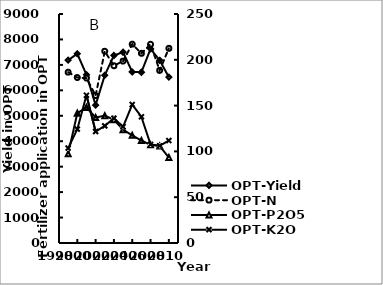
| Category | OPT-Yield |
|---|---|
| 1999.0 | 7187.37 |
| 2000.0 | 7436.929 |
| 2001.0 | 6612.92 |
| 2002.0 | 5419.915 |
| 2003.0 | 6594.876 |
| 2004.0 | 7372.167 |
| 2005.0 | 7499.449 |
| 2006.0 | 6723.919 |
| 2007.0 | 6710.755 |
| 2008.0 | 7629.795 |
| 2009.0 | 7180.129 |
| 2010.0 | 6517.03 |